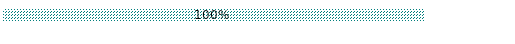
| Category | Conforme | Perfectible | Non conforme | Non concerné | À remplir |
|---|---|---|---|---|---|
| Conformité aux critères d'agrément N2 | 0 | 0 | 0 | 0 | 1 |